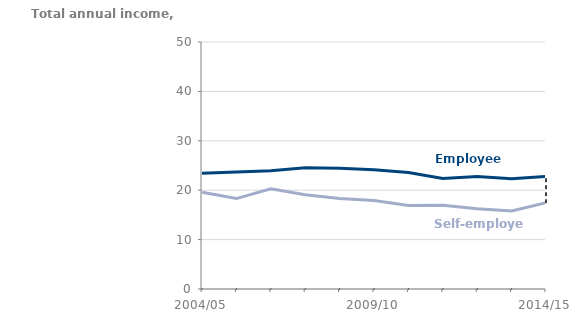
| Category | Employees | Self-employed |
|---|---|---|
| 2004/05 | 23431 | 19574 |
| 2005/06 | 23690 | 18303 |
| 2006/07 | 23938 | 20306 |
| 2007/08 | 24538 | 19067 |
| 2008/09 | 24428 | 18342 |
| 2009/10 | 24143 | 17926 |
| 2010/11 | 23583 | 16884 |
| 2011/12 | 22381 | 16941 |
| 2012/13 | 22785 | 16234 |
| 2013/14 | 22331 | 15803 |
| 2014/15 | 22800 | 17462 |